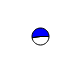
| Category | Series 0 |
|---|---|
| 0 | 12299 |
| 1 | 13503 |